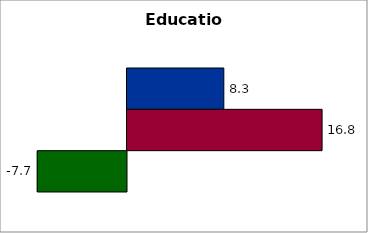
| Category | 50 states and D.C. | SREB states | State |
|---|---|---|---|
| 0 | 8.346 | 16.818 | -7.692 |